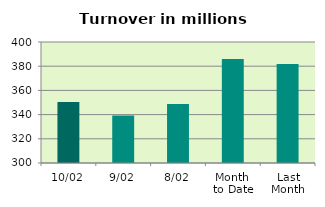
| Category | Series 0 |
|---|---|
| 10/02 | 350.432 |
| 9/02 | 339.222 |
| 8/02 | 348.833 |
| Month 
to Date | 386.005 |
| Last
Month | 381.872 |